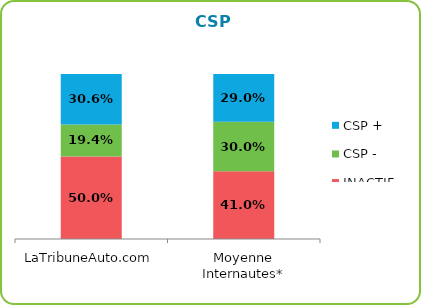
| Category | INACTIFS | CSP - | CSP + |
|---|---|---|---|
| LaTribuneAuto.com | 0.5 | 0.194 | 0.306 |
| Moyenne Internautes* | 0.41 | 0.3 | 0.29 |